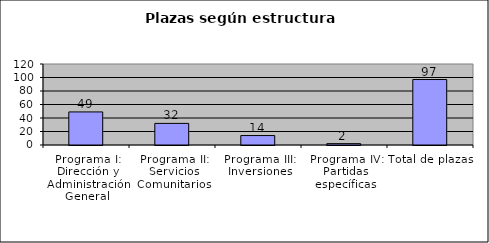
| Category | Series 0 |
|---|---|
| Programa I: Dirección y Administración General | 49 |
| Programa II: Servicios Comunitarios | 32 |
| Programa III: Inversiones | 14 |
| Programa IV: Partidas específicas | 2 |
| Total de plazas | 97 |